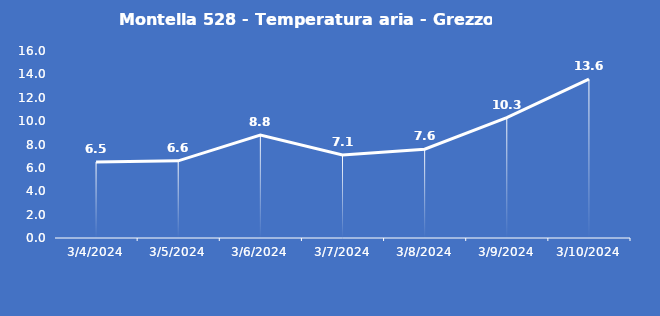
| Category | Montella 528 - Temperatura aria - Grezzo (°C) |
|---|---|
| 3/4/24 | 6.5 |
| 3/5/24 | 6.6 |
| 3/6/24 | 8.8 |
| 3/7/24 | 7.1 |
| 3/8/24 | 7.6 |
| 3/9/24 | 10.3 |
| 3/10/24 | 13.6 |